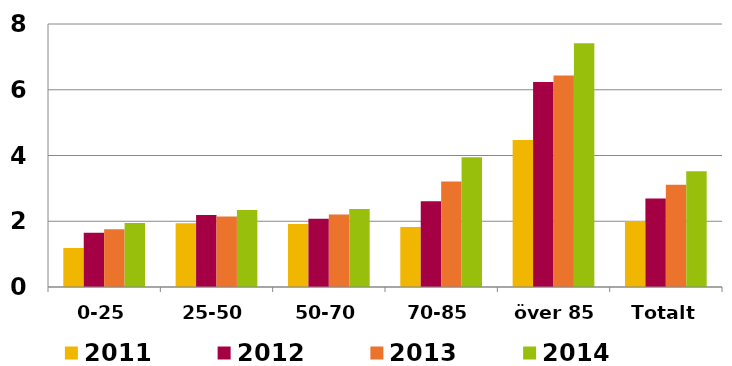
| Category | 2011 | 2012 | 2013 | 2014 |
|---|---|---|---|---|
| 0-25 | 1.186 | 1.647 | 1.76 | 1.943 |
| 25-50 | 1.938 | 2.19 | 2.143 | 2.339 |
| 50-70 | 1.92 | 2.073 | 2.202 | 2.373 |
| 70-85 | 1.826 | 2.611 | 3.208 | 3.944 |
| över 85 | 4.473 | 6.238 | 6.436 | 7.415 |
| Totalt | 2.01 | 2.695 | 3.108 | 3.524 |